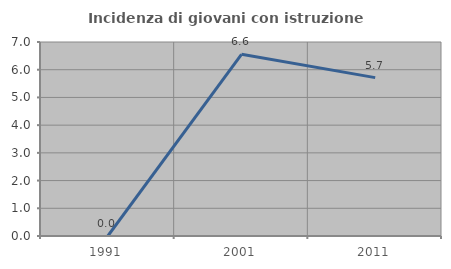
| Category | Incidenza di giovani con istruzione universitaria |
|---|---|
| 1991.0 | 0 |
| 2001.0 | 6.557 |
| 2011.0 | 5.714 |